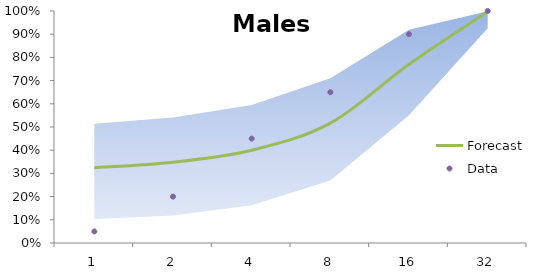
| Category | Forecast | Data |
|---|---|---|
| 0 | 0.324 | 0.05 |
| 1 | 0.348 | 0.2 |
| 2 | 0.4 | 0.45 |
| 3 | 0.516 | 0.65 |
| 4 | 0.77 | 0.9 |
| 5 | 0.998 | 1 |